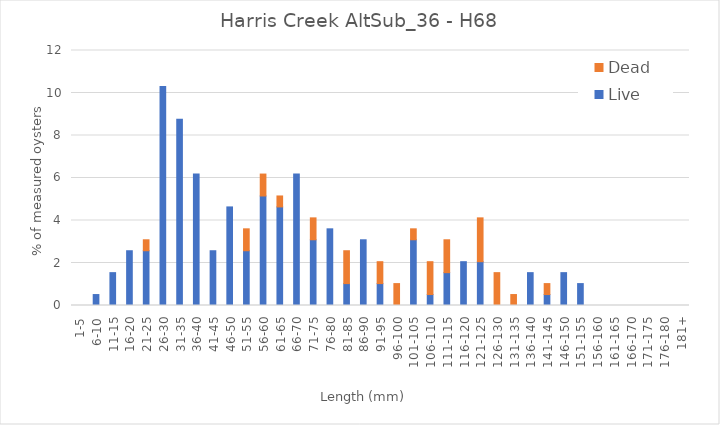
| Category | Live | Dead |
|---|---|---|
| 1-5 | 0 | 0 |
| 6-10 | 0.515 | 0 |
| 11-15 | 1.546 | 0 |
| 16-20 | 2.577 | 0 |
| 21-25 | 2.577 | 0.515 |
| 26-30 | 10.309 | 0 |
| 31-35 | 8.763 | 0 |
| 36-40 | 6.186 | 0 |
| 41-45 | 2.577 | 0 |
| 46-50 | 4.639 | 0 |
| 51-55 | 2.577 | 1.031 |
| 56-60 | 5.155 | 1.031 |
| 61-65 | 4.639 | 0.515 |
| 66-70 | 6.186 | 0 |
| 71-75 | 3.093 | 1.031 |
| 76-80 | 3.608 | 0 |
| 81-85 | 1.031 | 1.546 |
| 86-90 | 3.093 | 0 |
| 91-95 | 1.031 | 1.031 |
| 96-100 | 0 | 1.031 |
| 101-105 | 3.093 | 0.515 |
| 106-110 | 0.515 | 1.546 |
| 111-115 | 1.546 | 1.546 |
| 116-120 | 2.062 | 0 |
| 121-125 | 2.062 | 2.062 |
| 126-130 | 0 | 1.546 |
| 131-135 | 0 | 0.515 |
| 136-140 | 1.546 | 0 |
| 141-145 | 0.515 | 0.515 |
| 146-150 | 1.546 | 0 |
| 151-155 | 1.031 | 0 |
| 156-160 | 0 | 0 |
| 161-165 | 0 | 0 |
| 166-170 | 0 | 0 |
| 171-175 | 0 | 0 |
| 176-180 | 0 | 0 |
| 181+ | 0 | 0 |